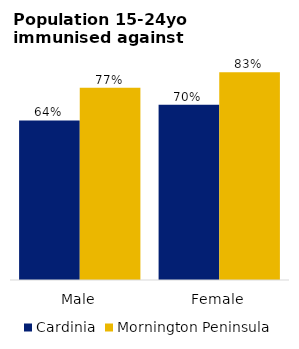
| Category | Cardinia | Mornington Peninsula |
|---|---|---|
| Male | 0.641 | 0.772 |
| Female | 0.704 | 0.835 |